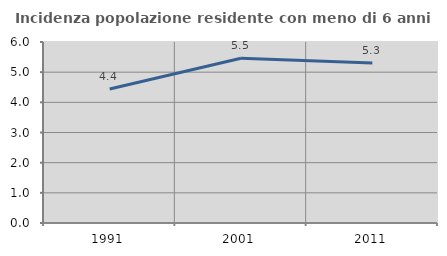
| Category | Incidenza popolazione residente con meno di 6 anni |
|---|---|
| 1991.0 | 4.441 |
| 2001.0 | 5.459 |
| 2011.0 | 5.307 |